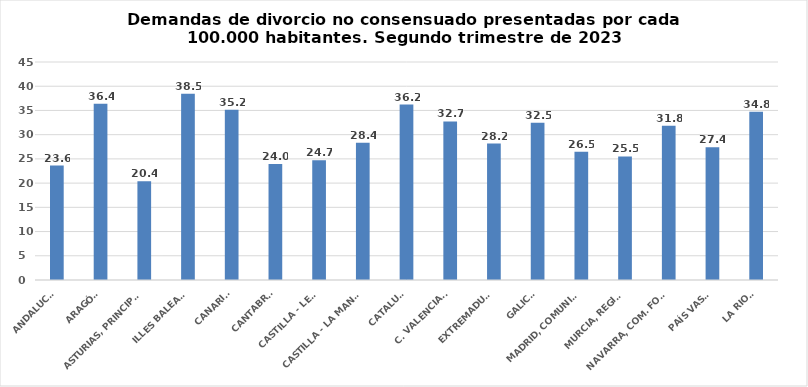
| Category | Series 0 |
|---|---|
| ANDALUCÍA | 23.625 |
| ARAGÓN | 36.388 |
| ASTURIAS, PRINCIPADO | 20.365 |
| ILLES BALEARS | 38.451 |
| CANARIAS | 35.157 |
| CANTABRIA | 23.958 |
| CASTILLA - LEÓN | 24.721 |
| CASTILLA - LA MANCHA | 28.357 |
| CATALUÑA | 36.207 |
| C. VALENCIANA | 32.731 |
| EXTREMADURA | 28.17 |
| GALICIA | 32.485 |
| MADRID, COMUNIDAD | 26.457 |
| MURCIA, REGIÓN | 25.504 |
| NAVARRA, COM. FORAL | 31.836 |
| PAÍS VASCO | 27.389 |
| LA RIOJA | 34.754 |